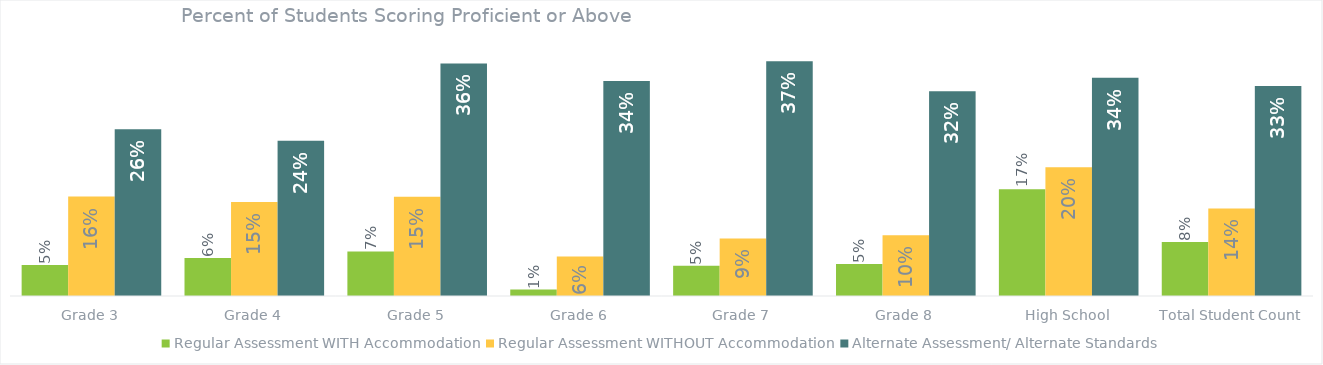
| Category | Regular Assessment WITH Accommodation | Regular Assessment WITHOUT Accommodation | Alternate Assessment/ Alternate Standards |
|---|---|---|---|
| Grade 3 | 0.048 | 0.155 | 0.26 |
| Grade 4 | 0.06 | 0.147 | 0.243 |
| Grade 5 | 0.07 | 0.155 | 0.363 |
| Grade 6 | 0.01 | 0.062 | 0.336 |
| Grade 7 | 0.047 | 0.09 | 0.367 |
| Grade 8 | 0.05 | 0.095 | 0.32 |
| High School | 0.167 | 0.201 | 0.341 |
| Total Student Count | 0.084 | 0.137 | 0.328 |